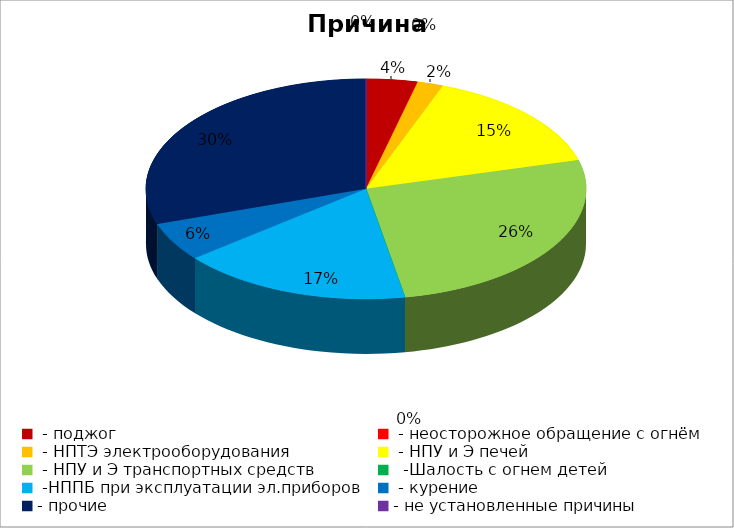
| Category | Причина пожара |
|---|---|
|  - поджог | 2 |
|  - неосторожное обращение с огнём | 0 |
|  - НПТЭ электрооборудования | 1 |
|  - НПУ и Э печей | 8 |
|  - НПУ и Э транспортных средств | 14 |
|   -Шалость с огнем детей | 0 |
|  -НППБ при эксплуатации эл.приборов | 9 |
|  - курение | 3 |
| - прочие | 16 |
| - не установленные причины | 0 |